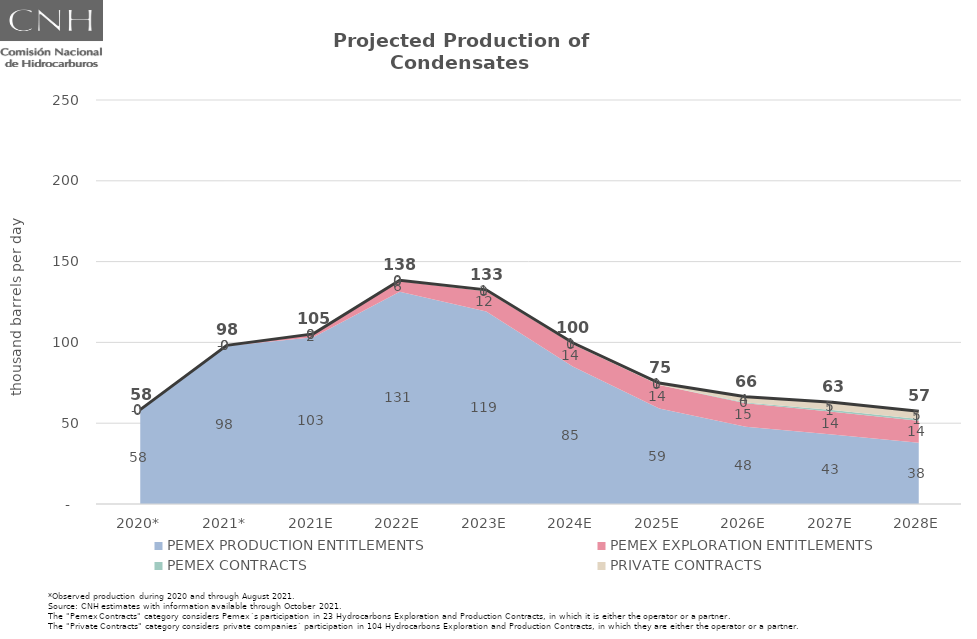
| Category | Total |
|---|---|
| 2020* | 58.422 |
| 2021* | 98.178 |
| 2021E | 105.272 |
| 2022E | 138.49 |
| 2023E | 132.523 |
| 2024E | 99.791 |
| 2025E | 74.884 |
| 2026E | 66.319 |
| 2027E | 63.017 |
| 2028E | 57.388 |